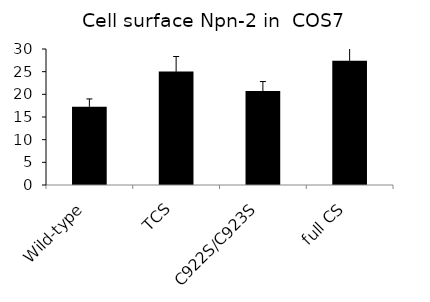
| Category | Particle Analysis |
|---|---|
| Wild-type | 17.285 |
| TCS | 25.045 |
| C922S/C923S | 20.72 |
| full CS | 27.4 |